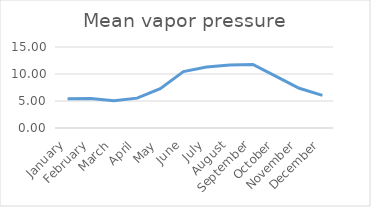
| Category | Series 0 |
|---|---|
| January | 5.403 |
| February | 5.47 |
| March | 5.03 |
| April | 5.527 |
| May | 7.27 |
| June | 10.439 |
| July | 11.283 |
| August | 11.66 |
| September | 11.779 |
| October | 9.554 |
| November | 7.36 |
| December | 6.053 |